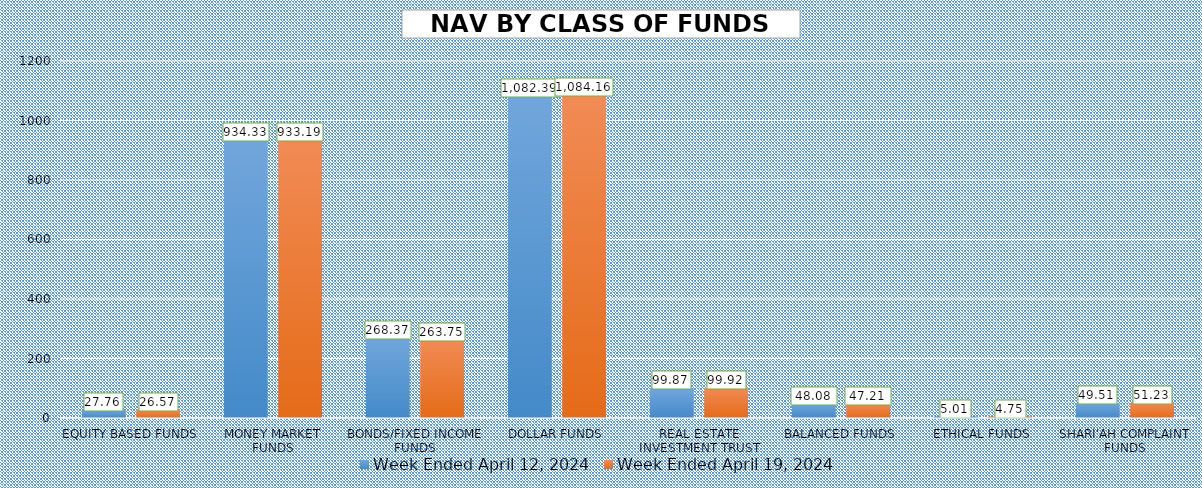
| Category | Week Ended April 12, 2024 | Week Ended April 19, 2024 |
|---|---|---|
| EQUITY BASED FUNDS | 27.76 | 26.572 |
| MONEY MARKET FUNDS | 934.335 | 933.193 |
| BONDS/FIXED INCOME FUNDS | 268.372 | 263.752 |
| DOLLAR FUNDS | 1082.391 | 1084.164 |
| REAL ESTATE INVESTMENT TRUST | 99.87 | 99.918 |
| BALANCED FUNDS | 48.079 | 47.214 |
| ETHICAL FUNDS | 5.005 | 4.753 |
| SHARI'AH COMPLAINT FUNDS | 49.51 | 51.232 |